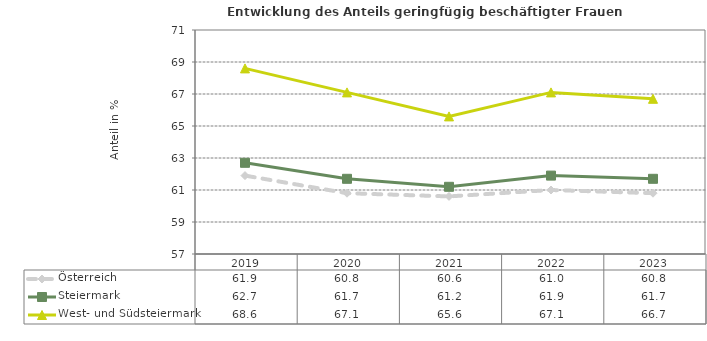
| Category | Österreich | Steiermark | West- und Südsteiermark |
|---|---|---|---|
| 2023.0 | 60.8 | 61.7 | 66.7 |
| 2022.0 | 61 | 61.9 | 67.1 |
| 2021.0 | 60.6 | 61.2 | 65.6 |
| 2020.0 | 60.8 | 61.7 | 67.1 |
| 2019.0 | 61.9 | 62.7 | 68.6 |